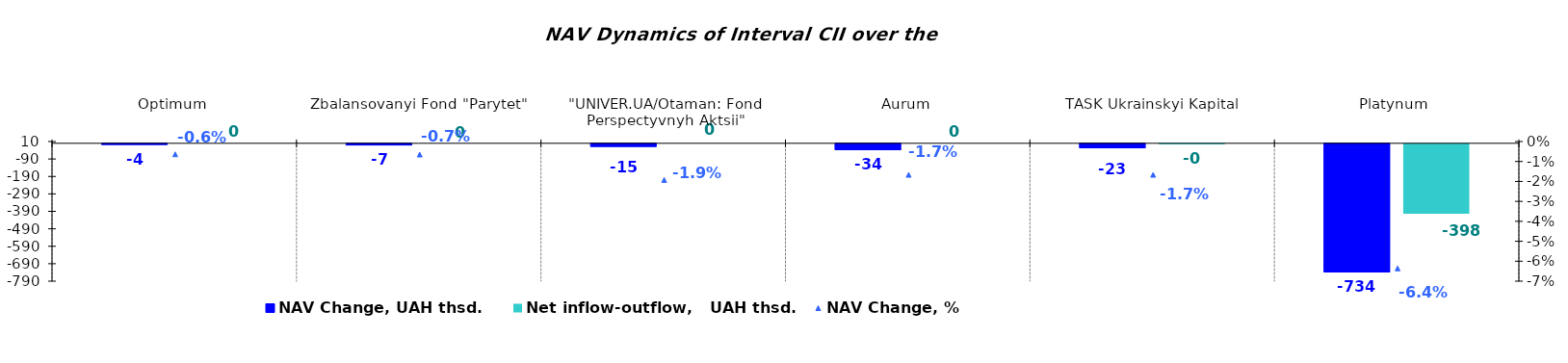
| Category | NAV Change, UAH thsd. | Net inflow-outflow,   UAH thsd. |
|---|---|---|
| Optimum | -4.077 | 0 |
| Zbalansovanyi Fond "Parytet" | -7.177 | 0 |
| "UNIVER.UA/Otaman: Fond Perspectyvnyh Aktsii" | -15.416 | 0 |
| Аurum | -33.706 | 0 |
| TASK Ukrainskyi Kapital | -23.21 | -0.465 |
| Platynum  | -734.408 | -397.916 |